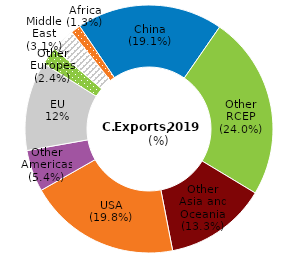
| Category | Share of exports |
|---|---|
| China | 14.682 |
| Other RCEP | 18.456 |
| Other Asia and Oceania | 10.242 |
| USA | 15.255 |
| Other Americas | 4.189 |
| EU | 8.955 |
| Other Europes | 1.812 |
| Middle East | 2.356 |
| Africa | 0.984 |